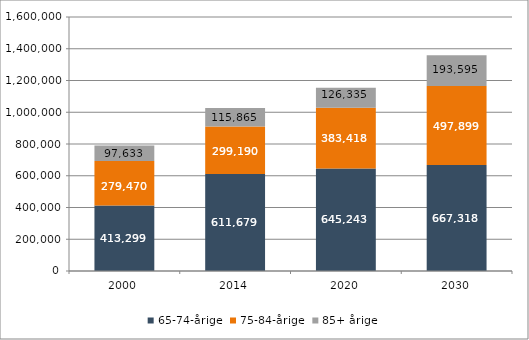
| Category | 65-74-årige | 75-84-årige | 85+ årige |
|---|---|---|---|
| 2000.0 | 413299 | 279470 | 97633 |
| 2014.0 | 611679 | 299190 | 115865 |
| 2020.0 | 645243 | 383418 | 126335 |
| 2030.0 | 667318 | 497899 | 193595 |